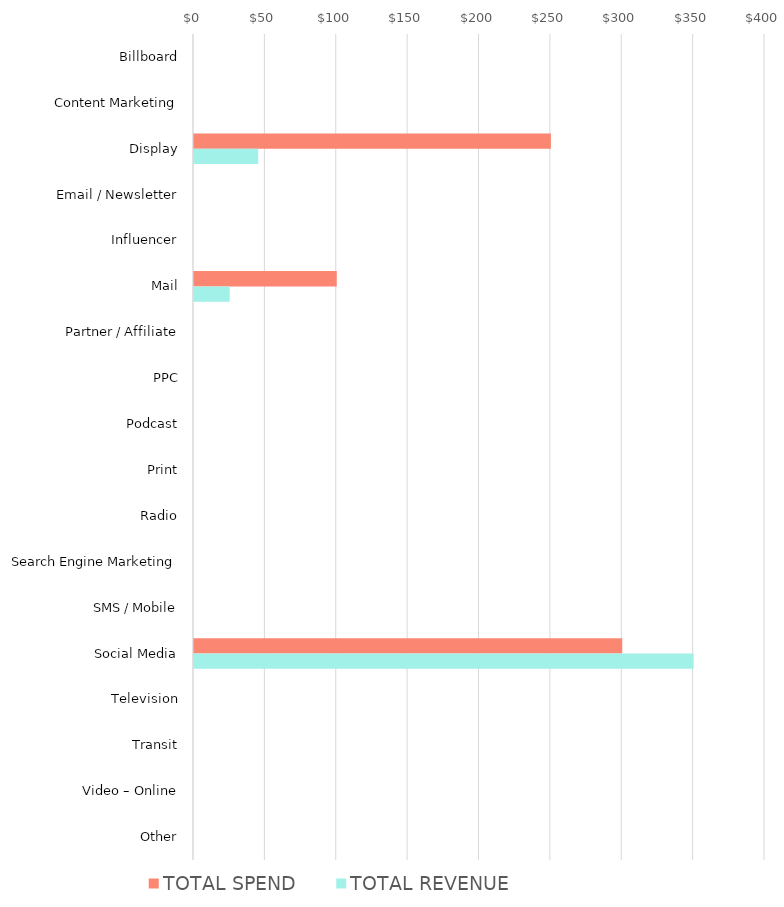
| Category | TOTAL SPEND | TOTAL REVENUE |
|---|---|---|
| Billboard | 0 | 0 |
| Content Marketing | 0 | 0 |
| Display | 250 | 45 |
| Email / Newsletter | 0 | 0 |
| Influencer | 0 | 0 |
| Mail | 100 | 25 |
| Partner / Affiliate | 0 | 0 |
| PPC | 0 | 0 |
| Podcast | 0 | 0 |
| Print | 0 | 0 |
| Radio | 0 | 0 |
| Search Engine Marketing | 0 | 0 |
| SMS / Mobile | 0 | 0 |
| Social Media | 300 | 350 |
| Television | 0 | 0 |
| Transit | 0 | 0 |
| Video – Online | 0 | 0 |
| Other | 0 | 0 |